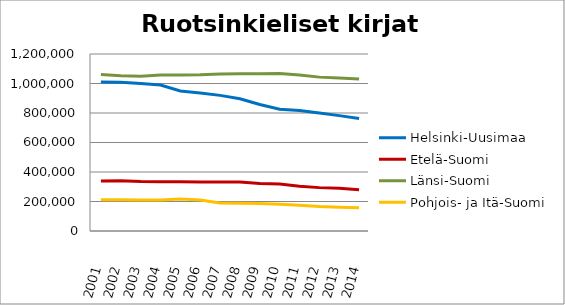
| Category | Helsinki-Uusimaa | Etelä-Suomi | Länsi-Suomi | Pohjois- ja Itä-Suomi |
|---|---|---|---|---|
| 2001.0 | 1010531 | 339474 | 1060845 | 211500 |
| 2002.0 | 1008182 | 340820 | 1052008 | 211868 |
| 2003.0 | 999497 | 335124 | 1048947 | 209329 |
| 2004.0 | 989157 | 334573 | 1057494 | 210701 |
| 2005.0 | 949658 | 334226 | 1057970 | 216743 |
| 2006.0 | 935158 | 332916 | 1059004 | 209530 |
| 2007.0 | 919547 | 332911 | 1064630 | 190504 |
| 2008.0 | 896765 | 332240 | 1065475 | 188007 |
| 2009.0 | 857930 | 321782 | 1066301 | 186096 |
| 2010.0 | 825526 | 319191 | 1068317 | 180944 |
| 2011.0 | 817109 | 302951 | 1057832 | 174663 |
| 2012.0 | 799486 | 294065 | 1043207 | 166088 |
| 2013.0 | 782241 | 289014 | 1037873 | 161020 |
| 2014.0 | 762660 | 279321 | 1030666 | 157340 |